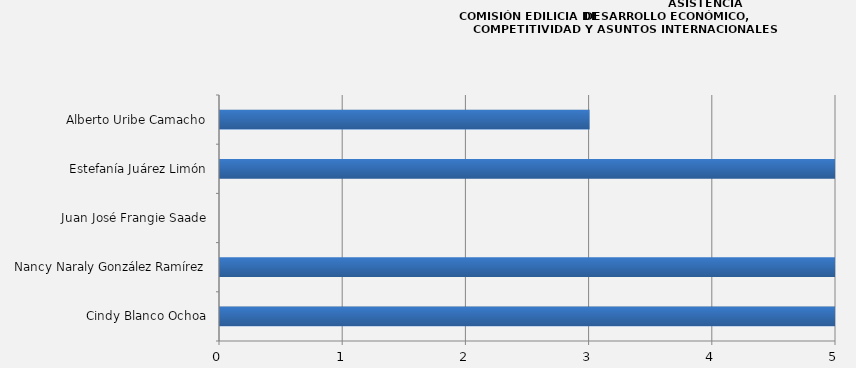
| Category | Series 0 |
|---|---|
| Cindy Blanco Ochoa | 9 |
| Nancy Naraly González Ramírez | 9 |
| Juan José Frangie Saade | 0 |
| Estefanía Juárez Limón | 9 |
| Alberto Uribe Camacho | 3 |